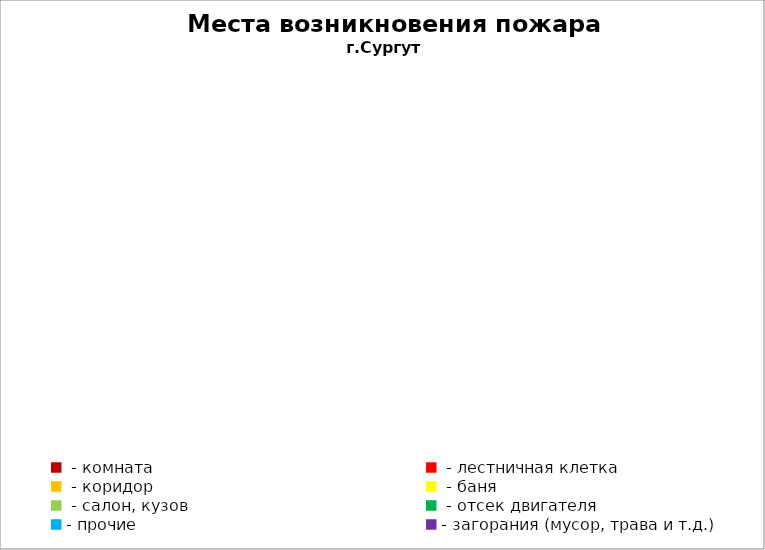
| Category | Места возникновения пожара |
|---|---|
|  - комната | 42 |
|  - лестничная клетка | 11 |
|  - коридор | 6 |
|  - баня | 17 |
|  - салон, кузов | 6 |
|  - отсек двигателя | 12 |
| - прочие | 66 |
| - загорания (мусор, трава и т.д.)  | 119 |